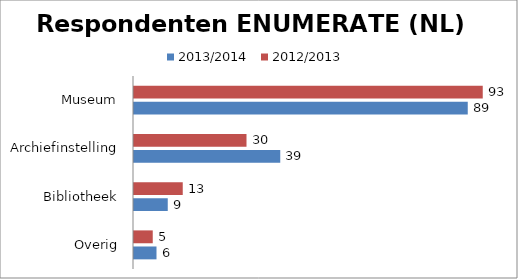
| Category | 2013/2014 | 2012/2013 |
|---|---|---|
| Overig | 6 | 5 |
| Bibliotheek | 9 | 13 |
| Archiefinstelling | 39 | 30 |
| Museum | 89 | 93 |